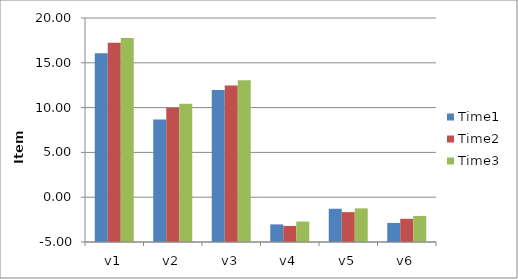
| Category | Time1 | Time2 | Time3 |
|---|---|---|---|
| v1 | 16.078 | 17.225 | 17.756 |
| v2 | 8.672 | 9.98 | 10.434 |
| v3 | 11.978 | 12.468 | 13.041 |
| v4 | -3.034 | -3.21 | -2.72 |
| v5 | -1.288 | -1.663 | -1.246 |
| v6 | -2.871 | -2.414 | -2.087 |